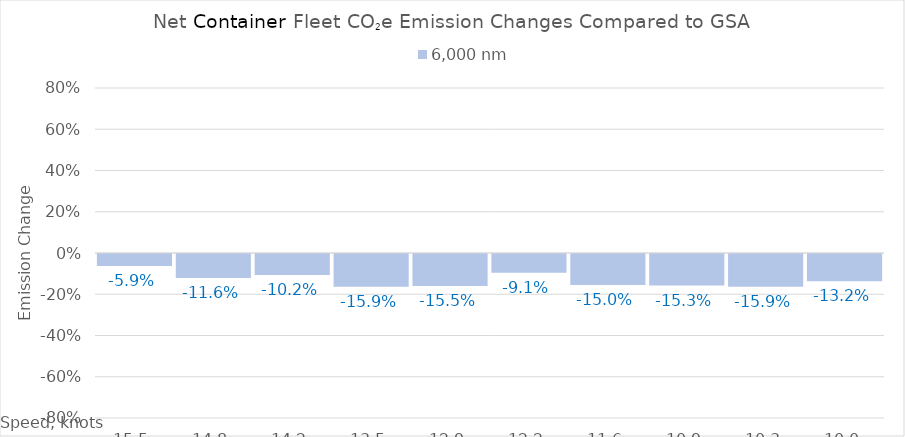
| Category | 6,000 |
|---|---|
| 15.450000000000001 | -0.059 |
| 14.8 | -0.116 |
| 14.15 | -0.102 |
| 13.5 | -0.159 |
| 12.85 | -0.155 |
| 12.2 | -0.091 |
| 11.549999999999999 | -0.15 |
| 10.899999999999999 | -0.153 |
| 10.249999999999998 | -0.159 |
| 10.0 | -0.132 |